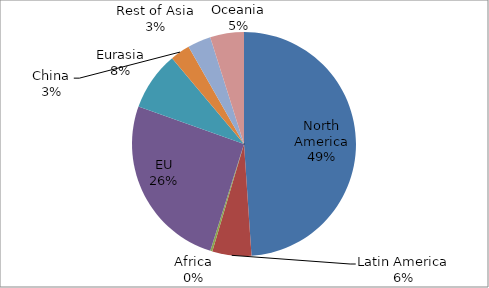
| Category | Series 0 |
|---|---|
| North America | 2.598 |
| Latin America | 0.299 |
| Africa | 0.016 |
| EU | 1.358 |
| Eurasia | 0.449 |
| China | 0.152 |
| Rest of Asia | 0.179 |
| Oceania | 0.259 |